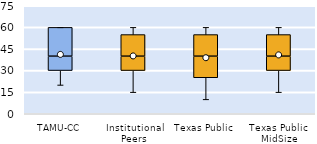
| Category | 25th | 50th | 75th |
|---|---|---|---|
| TAMU-CC | 30 | 10 | 20 |
| Institutional Peers | 30 | 10 | 15 |
| Texas Public | 25 | 15 | 15 |
| Texas Public MidSize | 30 | 10 | 15 |